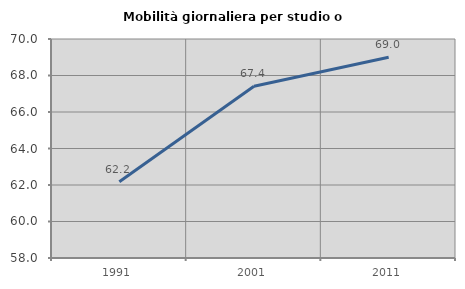
| Category | Mobilità giornaliera per studio o lavoro |
|---|---|
| 1991.0 | 62.182 |
| 2001.0 | 67.411 |
| 2011.0 | 69.004 |